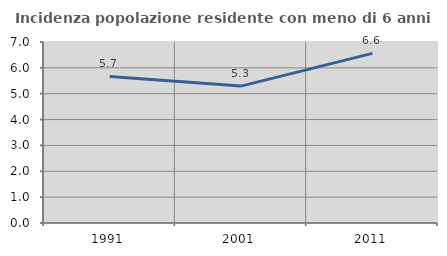
| Category | Incidenza popolazione residente con meno di 6 anni |
|---|---|
| 1991.0 | 5.667 |
| 2001.0 | 5.295 |
| 2011.0 | 6.56 |